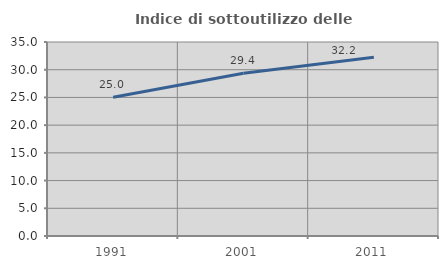
| Category | Indice di sottoutilizzo delle abitazioni  |
|---|---|
| 1991.0 | 25.019 |
| 2001.0 | 29.365 |
| 2011.0 | 32.237 |